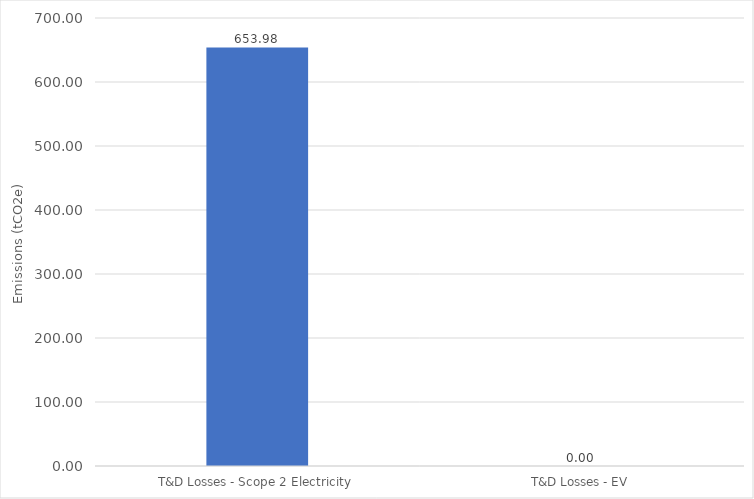
| Category | Series 0 |
|---|---|
| T&D Losses - Scope 2 Electricity | 653.981 |
| T&D Losses - EV | 0 |